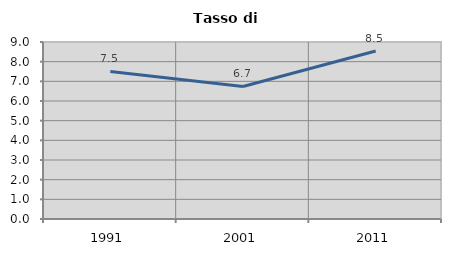
| Category | Tasso di disoccupazione   |
|---|---|
| 1991.0 | 7.503 |
| 2001.0 | 6.741 |
| 2011.0 | 8.539 |